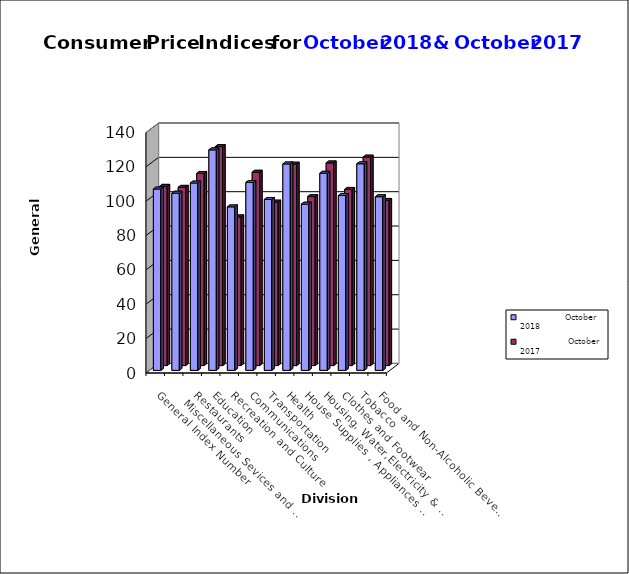
| Category |                October   2018 |                 October  2017 |
|---|---|---|
| Food and Non-Alcoholic Beverages | 101.1 | 96.2 |
| Tobacco | 120.3 | 121.4 |
| Clothes and Footwear | 101.8 | 102.6 |
| Housing, Water,Electricity & LPG  | 114.8 | 118 |
| House Supplies , Appliances & Maintenance | 96.8 | 98.4 |
| Health | 120.2 | 117.3 |
| Transportation | 99.5 | 95.2 |
| Communications | 109.4 | 112.6 |
| Recreation and Culture | 95.2 | 86.6 |
| Education | 128.4 | 127.5 |
| Restaurants | 109.1 | 111.9 |
|    Miscellaneous Sevices and Goods | 103.2 | 103.8 |
| General Index Number | 105.6 | 104.4 |